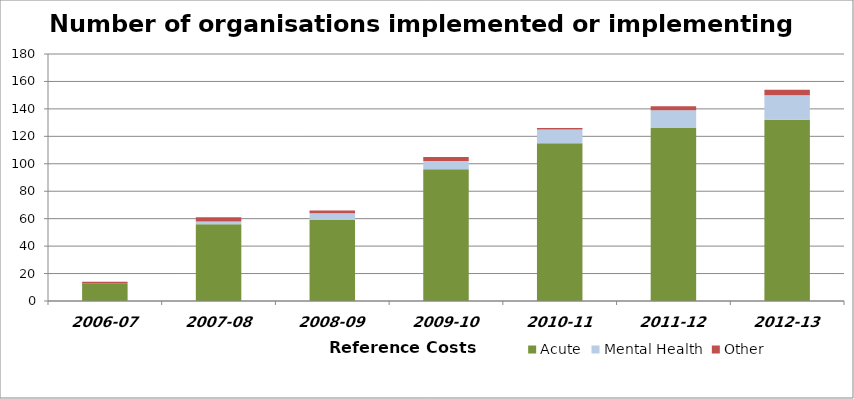
| Category | Acute | Mental Health | Other |
|---|---|---|---|
| 2006-07 | 13 | 0 | 1 |
| 2007-08 | 56 | 2 | 3 |
| 2008-09 | 59 | 5 | 2 |
| 2009-10 | 96 | 6 | 3 |
| 2010-11 | 115 | 10 | 1 |
| 2011-12 | 126 | 13 | 3 |
| 2012-13 | 132 | 18 | 4 |